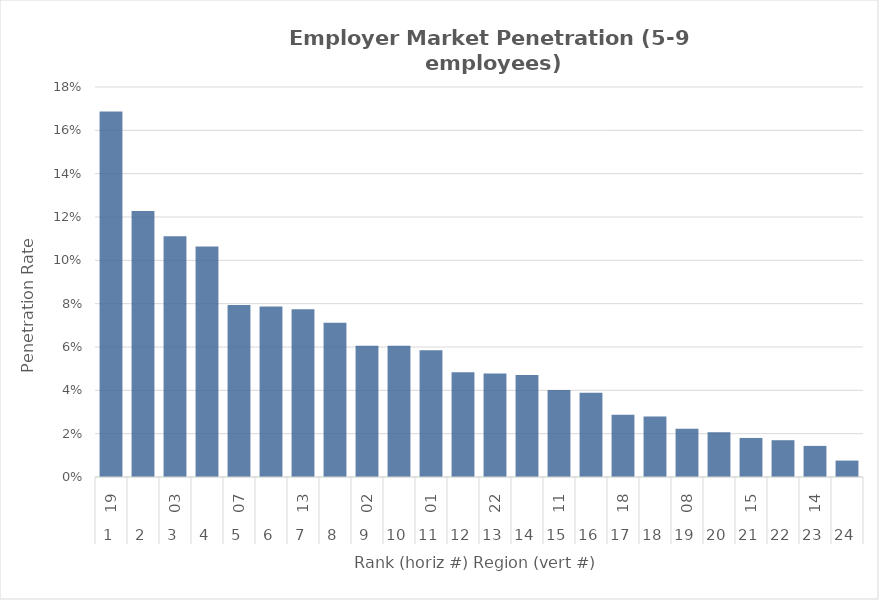
| Category | Rate |
|---|---|
| 0 | 0.169 |
| 1 | 0.123 |
| 2 | 0.111 |
| 3 | 0.106 |
| 4 | 0.079 |
| 5 | 0.079 |
| 6 | 0.077 |
| 7 | 0.071 |
| 8 | 0.061 |
| 9 | 0.061 |
| 10 | 0.059 |
| 11 | 0.048 |
| 12 | 0.048 |
| 13 | 0.047 |
| 14 | 0.04 |
| 15 | 0.039 |
| 16 | 0.029 |
| 17 | 0.028 |
| 18 | 0.022 |
| 19 | 0.021 |
| 20 | 0.018 |
| 21 | 0.017 |
| 22 | 0.014 |
| 23 | 0.008 |